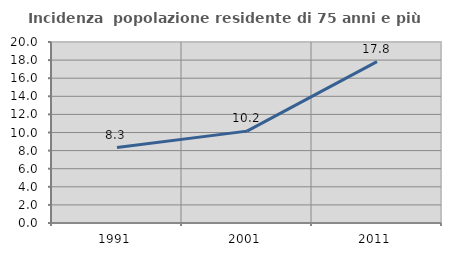
| Category | Incidenza  popolazione residente di 75 anni e più |
|---|---|
| 1991.0 | 8.333 |
| 2001.0 | 10.152 |
| 2011.0 | 17.838 |